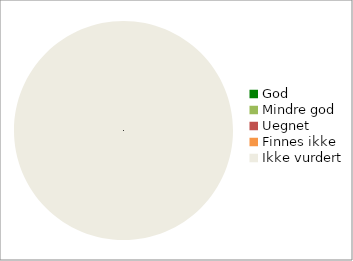
| Category | Series 0 |
|---|---|
| God | 0 |
| Mindre god | 0 |
| Uegnet | 0 |
| Finnes ikke | 0 |
| Ikke vurdert | 79 |